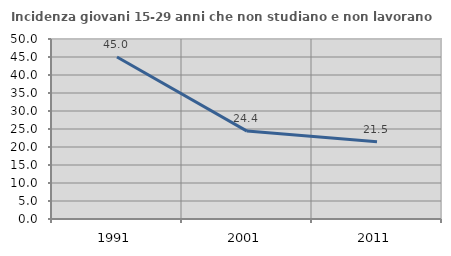
| Category | Incidenza giovani 15-29 anni che non studiano e non lavorano  |
|---|---|
| 1991.0 | 45 |
| 2001.0 | 24.424 |
| 2011.0 | 21.472 |